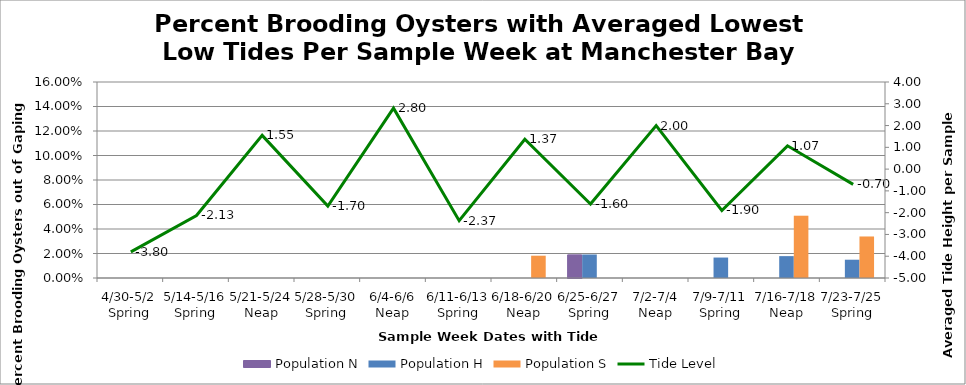
| Category | Population N | Population H | Population S |
|---|---|---|---|
| 4/30-5/2 Spring | 0 | 0 | 0 |
| 5/14-5/16 Spring | 0 | 0 | 0 |
| 5/21-5/24 Neap | 0 | 0 | 0 |
| 5/28-5/30 Spring | 0 | 0 | 0 |
| 6/4-6/6 Neap | 0 | 0 | 0 |
| 6/11-6/13 Spring | 0 | 0 | 0 |
| 6/18-6/20 Neap | 0 | 0 | 0.018 |
| 6/25-6/27 Spring | 0.019 | 0.019 | 0 |
| 7/2-7/4 Neap | 0 | 0 | 0 |
| 7/9-7/11 Spring | 0 | 0.017 | 0 |
| 7/16-7/18 Neap | 0 | 0.018 | 0.051 |
| 7/23-7/25 Spring | 0 | 0.015 | 0.034 |